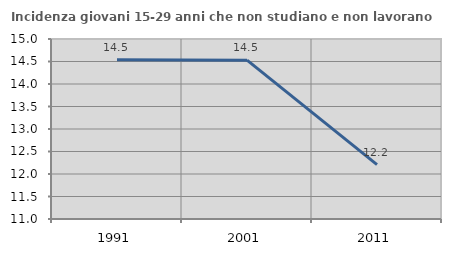
| Category | Incidenza giovani 15-29 anni che non studiano e non lavorano  |
|---|---|
| 1991.0 | 14.54 |
| 2001.0 | 14.53 |
| 2011.0 | 12.209 |